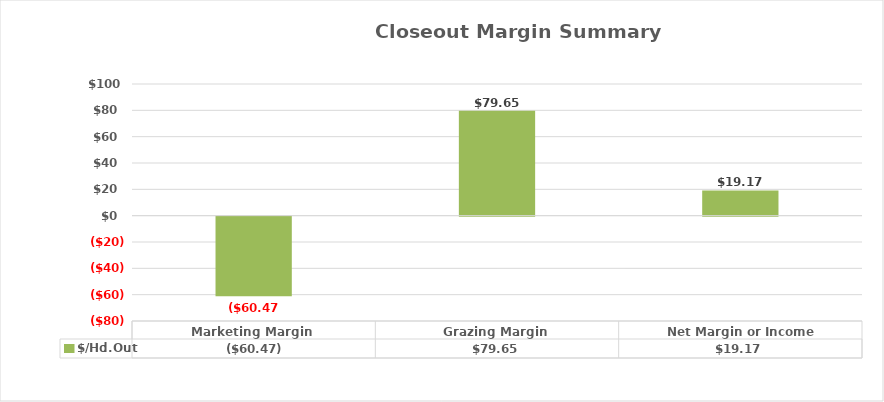
| Category | $/Hd.Out |
|---|---|
| Marketing Margin | -60.474 |
| Grazing Margin | 79.646 |
|  Net Margin or Income | 19.172 |